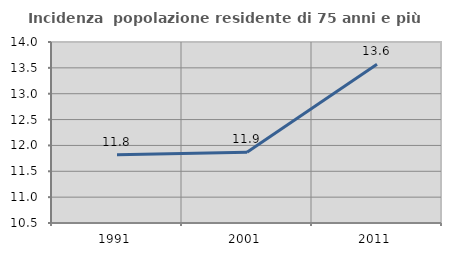
| Category | Incidenza  popolazione residente di 75 anni e più |
|---|---|
| 1991.0 | 11.818 |
| 2001.0 | 11.867 |
| 2011.0 | 13.57 |